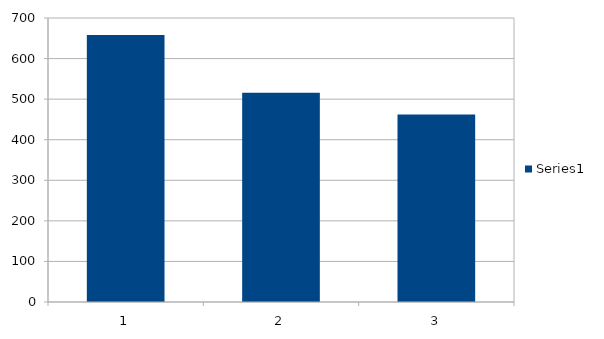
| Category | Series 0 |
|---|---|
| 0 | 658 |
| 1 | 516 |
| 2 | 462 |